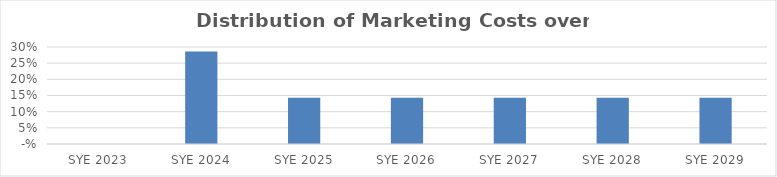
| Category | Series 0 |
|---|---|
| 2023.0 | 0 |
| 2024.0 | 0.286 |
| 2025.0 | 0.143 |
| 2026.0 | 0.143 |
| 2027.0 | 0.143 |
| 2028.0 | 0.143 |
| 2029.0 | 0.143 |